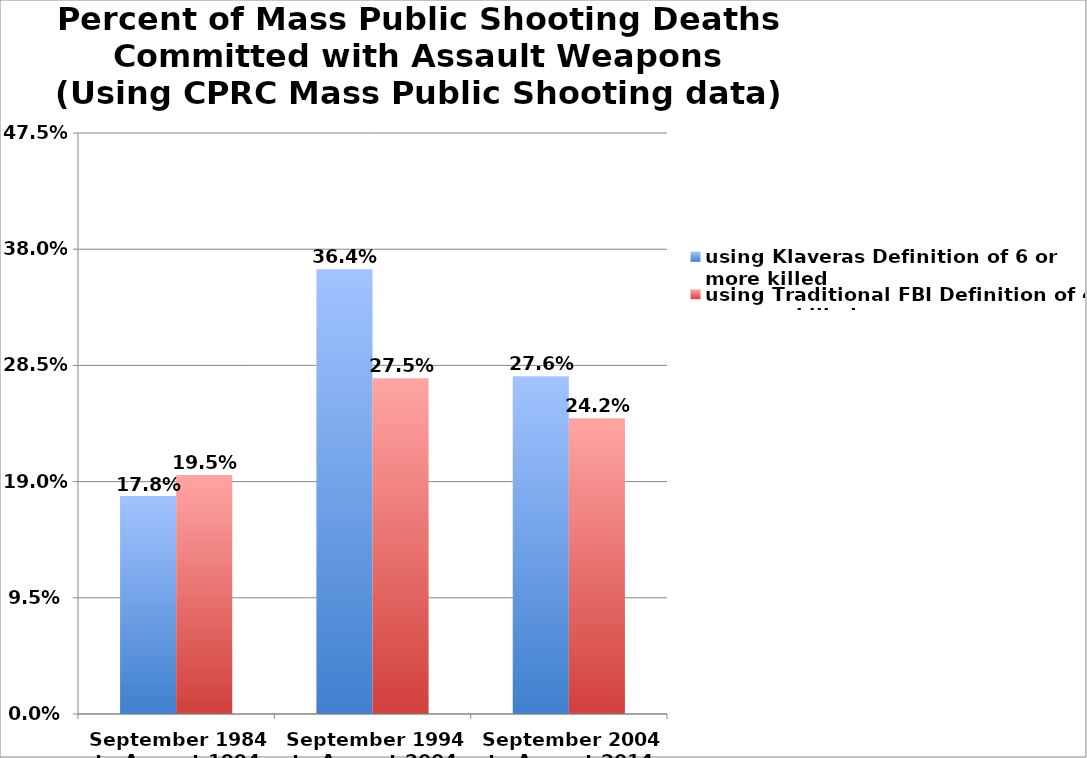
| Category | using Klaveras Definition of 6 or more killed | using Traditional FBI Definition of 4 or more killed |
|---|---|---|
| September 1984 to August 1994 | 0.178 | 0.195 |
| September 1994 to August 2004 | 0.364 | 0.275 |
| September 2004 to August 2014 | 0.276 | 0.242 |